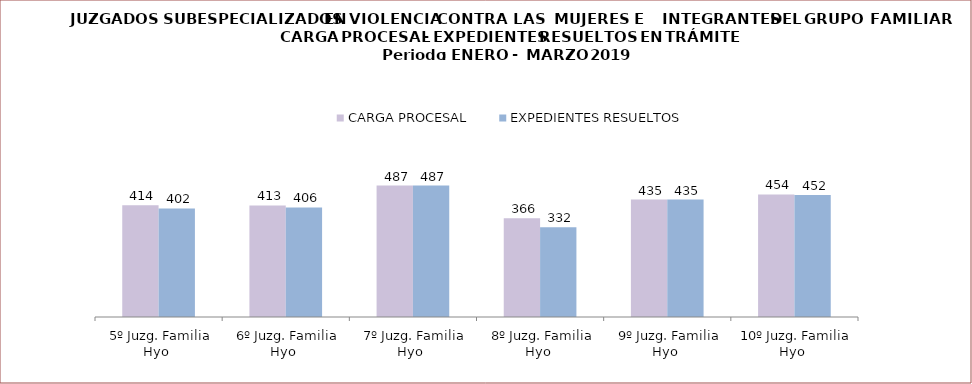
| Category | CARGA PROCESAL | EXPEDIENTES RESUELTOS |
|---|---|---|
| 5º Juzg. Familia Hyo | 414 | 402 |
| 6º Juzg. Familia Hyo | 413 | 406 |
| 7º Juzg. Familia Hyo | 487 | 487 |
| 8º Juzg. Familia Hyo | 366 | 332 |
| 9º Juzg. Familia Hyo | 435 | 435 |
| 10º Juzg. Familia Hyo | 454 | 452 |